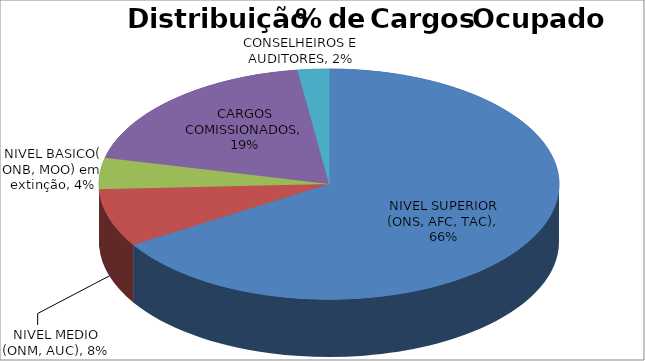
| Category | Series 0 |
|---|---|
| NIVEL SUPERIOR (ONS, AFC, TAC) | 0.662 |
| NIVEL MEDIO (ONM, AUC) | 0.081 |
| NIVEL BASICO( ONB, MOO) em extinção | 0.044 |
| CARGOS COMISSIONADOS | 0.191 |
| CONSELHEIROS E AUDITORES | 0.022 |